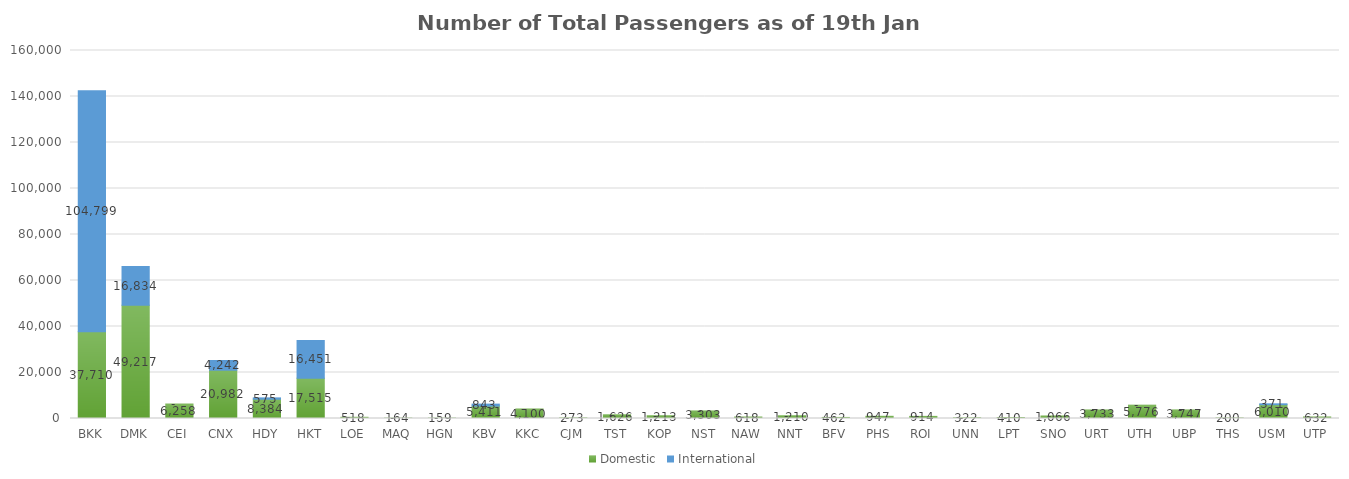
| Category | Domestic | International |
|---|---|---|
| BKK | 37710 | 104799 |
| DMK | 49217 | 16834 |
| CEI | 6258 | 0 |
| CNX | 20982 | 4242 |
| HDY | 8384 | 575 |
| HKT | 17515 | 16451 |
| LOE | 518 | 0 |
| MAQ | 164 | 0 |
| HGN | 159 | 0 |
| KBV | 5411 | 843 |
| KKC | 4100 | 0 |
| CJM | 273 | 0 |
| TST | 1626 | 0 |
| KOP | 1213 | 0 |
| NST | 3303 | 0 |
| NAW | 618 | 0 |
| NNT | 1210 | 0 |
| BFV | 462 | 0 |
| PHS | 947 | 0 |
| ROI | 914 | 0 |
| UNN | 322 | 0 |
| LPT | 410 | 0 |
| SNO | 1066 | 0 |
| URT | 3733 | 0 |
| UTH | 5776 | 0 |
| UBP | 3747 | 0 |
| THS | 200 | 0 |
| USM | 6010 | 371 |
| UTP | 632 | 0 |